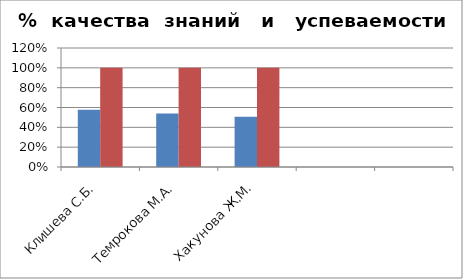
| Category | Series 0 | 2 |
|---|---|---|
| Клишева С.Б. | 0.577 | 1 |
| Темрокова М.А. | 0.538 | 1 |
| Хакунова Ж.М. | 0.507 | 1 |